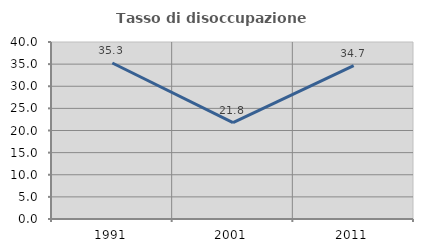
| Category | Tasso di disoccupazione giovanile  |
|---|---|
| 1991.0 | 35.255 |
| 2001.0 | 21.798 |
| 2011.0 | 34.675 |